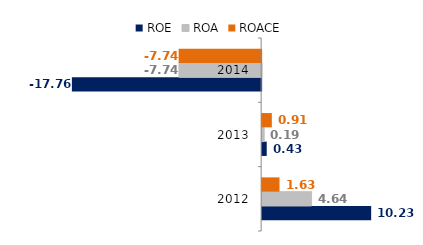
| Category | ROE | ROA | ROACE |
|---|---|---|---|
| 2012.0 | 10.23 | 4.64 | 1.63 |
| 2013.0 | 0.43 | 0.19 | 0.91 |
| 2014.0 | -17.76 | -7.74 | -7.74 |